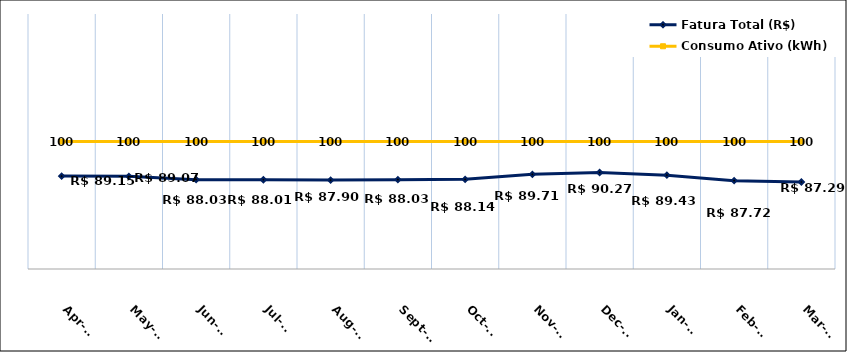
| Category | Fatura Total (R$) |
|---|---|
| 2023-04-01 | 89.15 |
| 2023-05-01 | 89.07 |
| 2023-06-01 | 88.03 |
| 2023-07-01 | 88.01 |
| 2023-08-01 | 87.9 |
| 2023-09-01 | 88.03 |
| 2023-10-01 | 88.14 |
| 2023-11-01 | 89.71 |
| 2023-12-01 | 90.27 |
| 2024-01-01 | 89.43 |
| 2024-02-01 | 87.72 |
| 2024-03-01 | 87.29 |